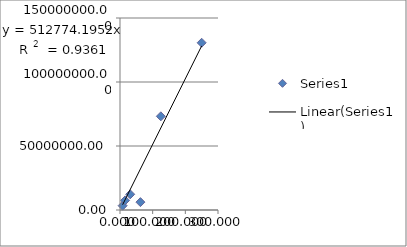
| Category | Series 0 |
|---|---|
| 8.06 | 3378492.577 |
| 15.625 | 7498086.732 |
| 31.25 | 12257324.598 |
| 62.5 | 6147896.925 |
| 125.0 | 73188857.011 |
| 250.0 | 130649938.335 |